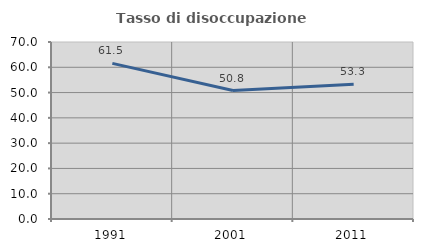
| Category | Tasso di disoccupazione giovanile  |
|---|---|
| 1991.0 | 61.538 |
| 2001.0 | 50.806 |
| 2011.0 | 53.333 |